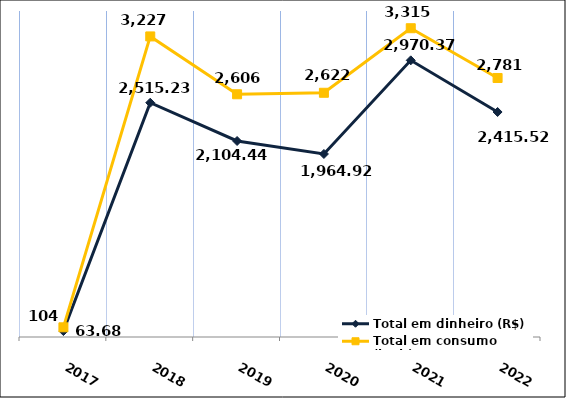
| Category | Total em dinheiro (R$) |
|---|---|
| 2017.0 | 63.68 |
| 2018.0 | 2515.23 |
| 2019.0 | 2104.44 |
| 2020.0 | 1964.92 |
| 2021.0 | 2970.37 |
| 2022.0 | 2415.52 |